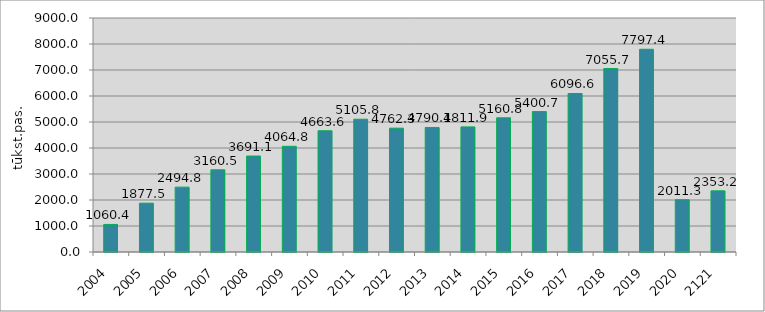
| Category | Series 0 |
|---|---|
| 2004.0 | 1060.384 |
| 2005.0 | 1877.461 |
| 2006.0 | 2494.835 |
| 2007.0 | 3160.535 |
| 2008.0 | 3691.099 |
| 2009.0 | 4064.755 |
| 2010.0 | 4663.647 |
| 2011.0 | 5105.818 |
| 2012.0 | 4762.335 |
| 2013.0 | 4790.136 |
| 2014.0 | 4811.949 |
| 2015.0 | 5160.759 |
| 2016.0 | 5400.709 |
| 2017.0 | 6096.62 |
| 2018.0 | 7055.734 |
| 2019.0 | 7797.4 |
| 2020.0 | 2011.3 |
| 2121.0 | 2353.2 |